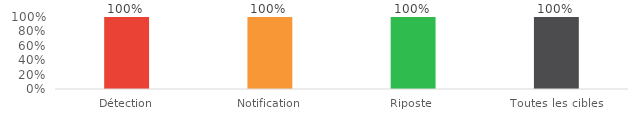
| Category | Series 0 |
|---|---|
| Détection | 1 |
| Notification | 1 |
| Riposte  | 1 |
| Toutes les cibles | 1 |